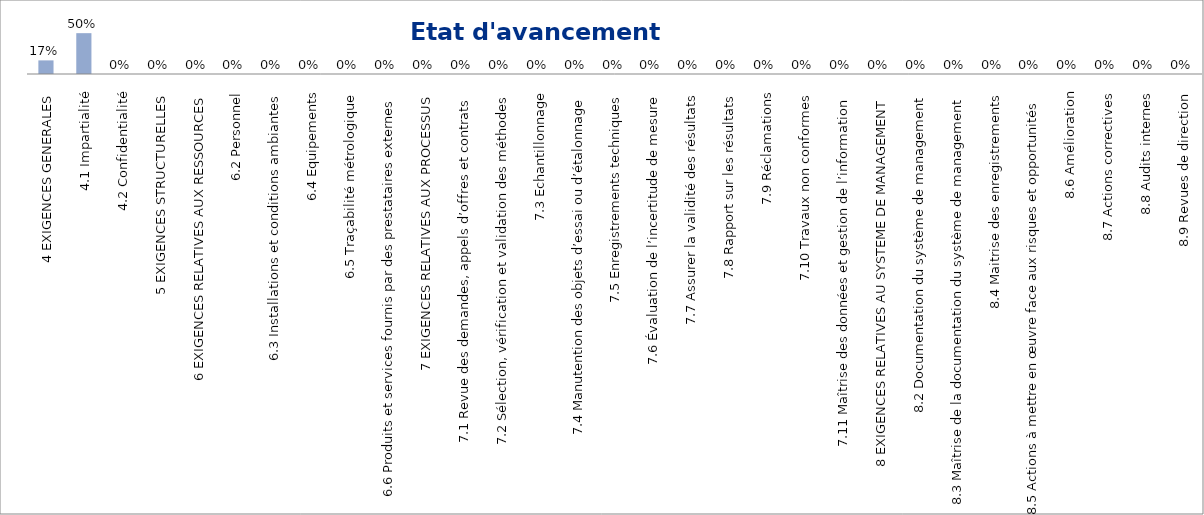
| Category | Series 1 |
|---|---|
| 4 EXIGENCES GENERALES | 0.167 |
| 4.1 Impartialité | 0.5 |
| 4.2 Confidentialité | 0 |
| 5 EXIGENCES STRUCTURELLES | 0 |
| 6 EXIGENCES RELATIVES AUX RESSOURCES | 0 |
| 6.2 Personnel | 0 |
| 6.3 Installations et conditions ambiantes | 0 |
| 6.4 Equipements | 0 |
| 6.5 Traçabilité métrologique | 0 |
| 6.6 Produits et services fournis par des prestataires externes | 0 |
| 7 EXIGENCES RELATIVES AUX PROCESSUS | 0 |
| 7.1 Revue des demandes, appels d’offres et contrats | 0 |
| 7.2 Sélection, vérification et validation des méthodes | 0 |
| 7.3 Echantillonnage | 0 |
| 7.4 Manutention des objets d’essai ou d’étalonnage | 0 |
| 7.5 Enregistrements techniques | 0 |
| 7.6 Évaluation de l’incertitude de mesure | 0 |
| 7.7 Assurer la validité des résultats | 0 |
| 7.8 Rapport sur les résultats | 0 |
| 7.9 Réclamations | 0 |
| 7.10 Travaux non conformes | 0 |
| 7.11 Maîtrise des données et gestion de l’information | 0 |
| 8 EXIGENCES RELATIVES AU SYSTEME DE MANAGEMENT | 0 |
| 8.2 Documentation du système de management | 0 |
| 8.3 Maîtrise de la documentation du système de management | 0 |
| 8.4 Maitrise des enregistrements | 0 |
| 8.5 Actions à mettre en œuvre face aux risques et opportunités | 0 |
| 8.6 Amélioration | 0 |
| 8.7 Actions correctives | 0 |
| 8.8 Audits internes | 0 |
| 8.9 Revues de direction | 0 |